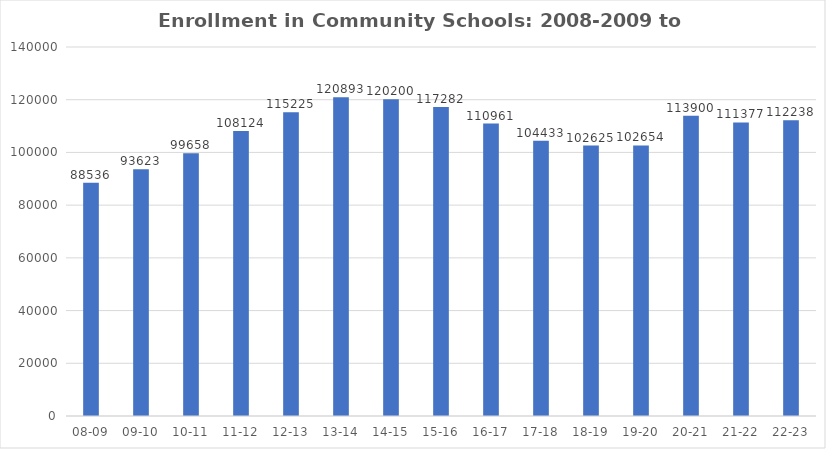
| Category | FTE of Students |
|---|---|
| 08-09 | 88535.75 |
| 09-10 | 93622.93 |
| 10-11 | 99658.07 |
| 11-12 | 108123.83 |
| 12-13 | 115225.18 |
| 13-14 | 120893.46 |
| 14-15 | 120199.59 |
| 15-16 | 117282.09 |
| 16-17 | 110960.96 |
| 17-18 | 104432.96 |
| 18-19 | 102624.9 |
| 19-20 | 102654.02 |
| 20-21 | 113899.55 |
| 21-22 | 111377 |
| 22-23 | 112238 |